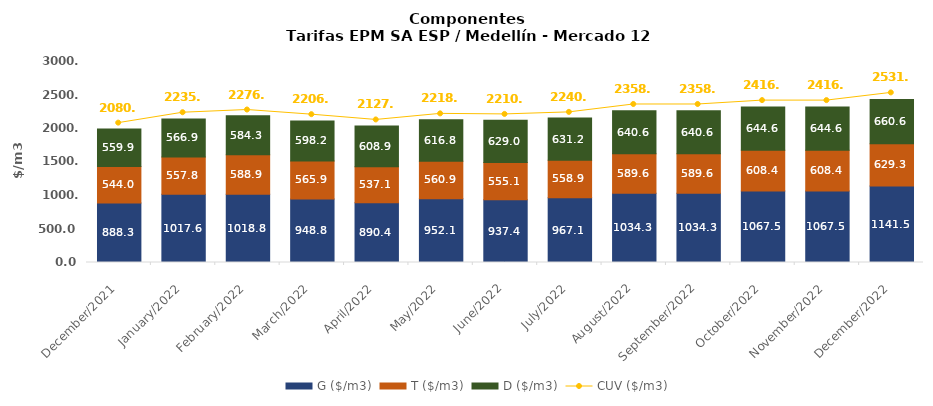
| Category | G ($/m3) | T ($/m3) | D ($/m3) |
|---|---|---|---|
| 2021-12-01 | 888.25 | 543.96 | 559.88 |
| 2022-01-01 | 1017.59 | 557.8 | 566.91 |
| 2022-02-01 | 1018.83 | 588.88 | 584.28 |
| 2022-03-01 | 948.81 | 565.86 | 598.22 |
| 2022-04-01 | 890.41 | 537.06 | 608.87 |
| 2022-05-01 | 952.08 | 560.91 | 616.84 |
| 2022-06-01 | 937.38 | 555.07 | 629.04 |
| 2022-07-01 | 967.08 | 558.87 | 631.23 |
| 2022-08-01 | 1034.31 | 589.64 | 640.63 |
| 2022-09-01 | 1034.31 | 589.64 | 640.63 |
| 2022-10-01 | 1067.51 | 608.44 | 644.64 |
| 2022-11-01 | 1067.51 | 608.44 | 644.64 |
| 2022-12-01 | 1141.53 | 629.26 | 660.56 |